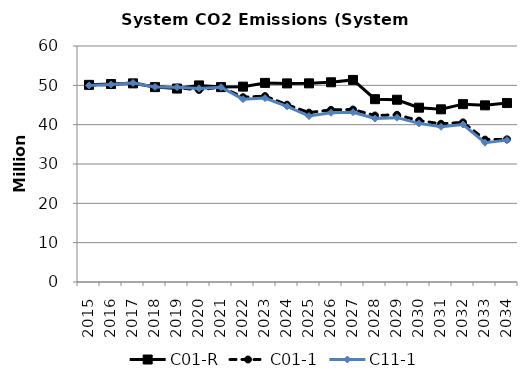
| Category | C01-R | C01-1 | C11-1 |
|---|---|---|---|
| 2015.0 | 50.118 | 49.98 | 49.98 |
| 2016.0 | 50.329 | 50.239 | 50.228 |
| 2017.0 | 50.499 | 50.623 | 50.598 |
| 2018.0 | 49.555 | 49.637 | 49.601 |
| 2019.0 | 49.181 | 49.422 | 49.528 |
| 2020.0 | 49.976 | 48.827 | 49.225 |
| 2021.0 | 49.548 | 49.578 | 49.533 |
| 2022.0 | 49.671 | 46.971 | 46.477 |
| 2023.0 | 50.618 | 47.262 | 46.76 |
| 2024.0 | 50.491 | 45.086 | 44.651 |
| 2025.0 | 50.508 | 43.063 | 42.198 |
| 2026.0 | 50.777 | 43.764 | 43.027 |
| 2027.0 | 51.38 | 43.847 | 43.169 |
| 2028.0 | 46.481 | 42.329 | 41.56 |
| 2029.0 | 46.342 | 42.511 | 41.78 |
| 2030.0 | 44.317 | 41.021 | 40.322 |
| 2031.0 | 43.901 | 40.228 | 39.47 |
| 2032.0 | 45.215 | 40.585 | 40.034 |
| 2033.0 | 44.915 | 36.207 | 35.422 |
| 2034.0 | 45.496 | 36.272 | 36.071 |